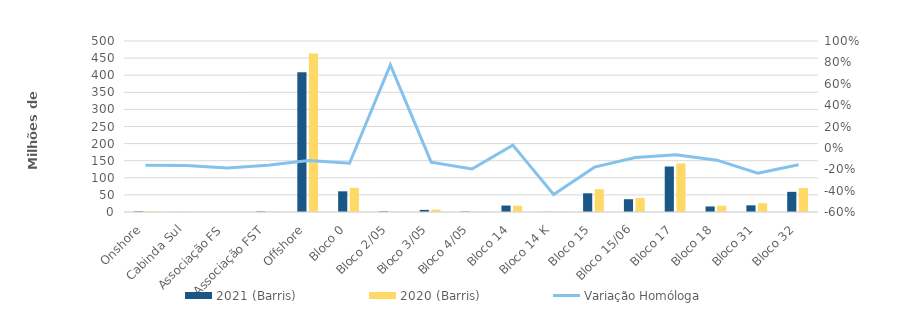
| Category | 2021 (Barris) | 2020 (Barris) |
|---|---|---|
| Onshore | 1834517 | 2192523 |
| Cabinda Sul | 208900 | 250209 |
| Associação FS | 87451 | 107797 |
| Associação FST | 1538166 | 1834517 |
| Offshore | 408592250 | 463161739 |
| Bloco 0 | 60504246 | 70671471 |
| Bloco 2/05 | 1651641 | 929895 |
| Bloco 3/05 | 6233998 | 7196775 |
| Bloco 4/05 | 1137804 | 1417223 |
| Bloco 14 | 18917587 | 18443238 |
| Bloco 14 K | 428776 | 761104 |
| Bloco 15 | 54659686 | 66682860 |
| Bloco 15/06 | 37358573 | 41046994 |
| Bloco 17 | 132971317 | 142075446 |
| Bloco 18 | 16260781 | 18376934 |
| Bloco 31 | 19519355 | 25589106 |
| Bloco 32 | 58948488 | 69970695 |